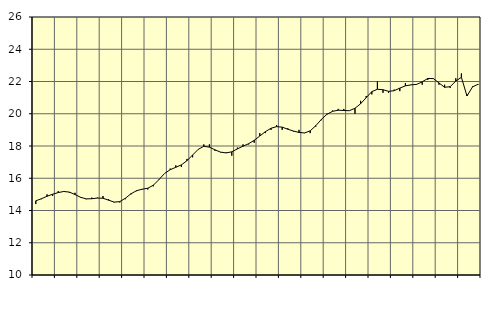
| Category | Piggar | Finansiell verksamhet, företagstjänster, SNI 64-82 |
|---|---|---|
| nan | 14.4 | 14.6 |
| 1.0 | 14.7 | 14.73 |
| 1.0 | 15 | 14.88 |
| 1.0 | 14.9 | 15.01 |
| nan | 15.2 | 15.11 |
| 2.0 | 15.2 | 15.18 |
| 2.0 | 15.1 | 15.14 |
| 2.0 | 15.1 | 14.99 |
| nan | 14.8 | 14.82 |
| 3.0 | 14.7 | 14.72 |
| 3.0 | 14.8 | 14.73 |
| 3.0 | 14.8 | 14.77 |
| nan | 14.9 | 14.76 |
| 4.0 | 14.7 | 14.64 |
| 4.0 | 14.5 | 14.52 |
| 4.0 | 14.5 | 14.55 |
| nan | 14.7 | 14.76 |
| 5.0 | 15 | 15.04 |
| 5.0 | 15.2 | 15.23 |
| 5.0 | 15.3 | 15.32 |
| nan | 15.3 | 15.38 |
| 6.0 | 15.5 | 15.57 |
| 6.0 | 15.9 | 15.92 |
| 6.0 | 16.3 | 16.3 |
| nan | 16.6 | 16.53 |
| 7.0 | 16.8 | 16.68 |
| 7.0 | 16.7 | 16.83 |
| 7.0 | 17.2 | 17.09 |
| nan | 17.3 | 17.44 |
| 8.0 | 17.8 | 17.79 |
| 8.0 | 18.1 | 17.98 |
| 8.0 | 18.1 | 17.93 |
| nan | 17.7 | 17.76 |
| 9.0 | 17.6 | 17.62 |
| 9.0 | 17.6 | 17.57 |
| 9.0 | 17.4 | 17.64 |
| nan | 17.9 | 17.82 |
| 10.0 | 18.1 | 17.99 |
| 10.0 | 18.1 | 18.14 |
| 10.0 | 18.2 | 18.35 |
| nan | 18.8 | 18.62 |
| 11.0 | 18.8 | 18.89 |
| 11.0 | 19 | 19.1 |
| 11.0 | 19.3 | 19.2 |
| nan | 19 | 19.17 |
| 12.0 | 19.1 | 19.04 |
| 12.0 | 18.9 | 18.93 |
| 12.0 | 19 | 18.84 |
| nan | 18.8 | 18.81 |
| 13.0 | 18.8 | 18.94 |
| 13.0 | 19.2 | 19.26 |
| 13.0 | 19.6 | 19.65 |
| nan | 20 | 19.97 |
| 14.0 | 20.2 | 20.15 |
| 14.0 | 20.3 | 20.22 |
| 14.0 | 20.3 | 20.2 |
| nan | 20.2 | 20.19 |
| 15.0 | 20 | 20.34 |
| 15.0 | 20.8 | 20.62 |
| 15.0 | 21.1 | 21 |
| nan | 21.2 | 21.37 |
| 16.0 | 22 | 21.52 |
| 16.0 | 21.3 | 21.49 |
| 16.0 | 21.3 | 21.39 |
| nan | 21.5 | 21.43 |
| 17.0 | 21.4 | 21.59 |
| 17.0 | 21.9 | 21.73 |
| 17.0 | 21.8 | 21.79 |
| nan | 21.8 | 21.82 |
| 18.0 | 21.8 | 21.98 |
| 18.0 | 22.1 | 22.19 |
| 18.0 | 22.2 | 22.18 |
| nan | 21.8 | 21.91 |
| 19.0 | 21.8 | 21.64 |
| 19.0 | 21.6 | 21.68 |
| 19.0 | 22.2 | 22.03 |
| nan | 22.5 | 22.26 |
| 20.0 | 21.2 | 21.1 |
| 20.0 | 21.7 | 21.67 |
| 20.0 | 21.8 | 21.83 |